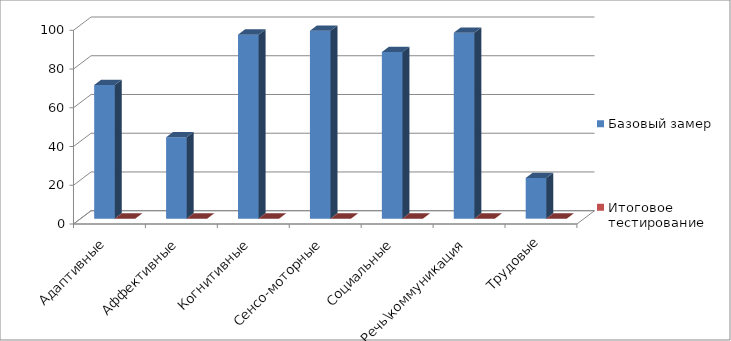
| Category | Базовый замер | Итоговое тестирование |
|---|---|---|
| Адаптивные | 69 | 0 |
| Аффективные | 42 | 0 |
| Когнитивные | 95 | 0 |
| Сенсо-моторные | 97 | 0 |
| Социальные | 86 | 0 |
| Речь\коммуникация | 96 | 0 |
| Трудовые | 21 | 0 |